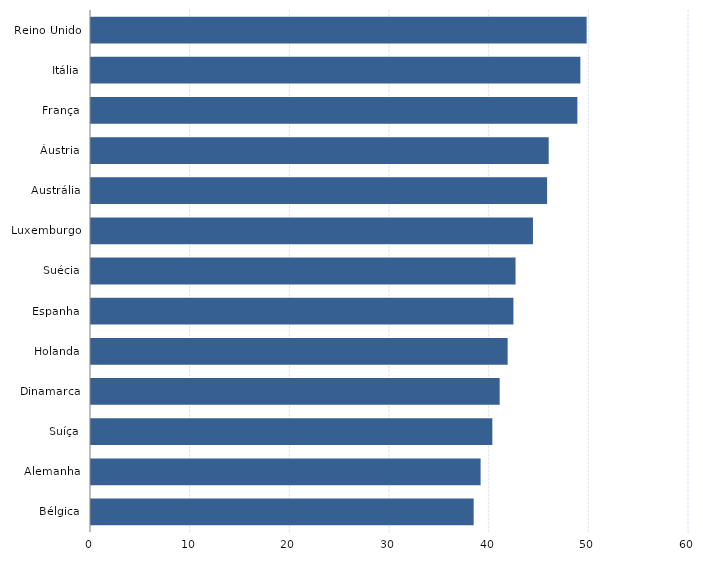
| Category | Series 0 |
|---|---|
| Bélgica | 38.396 |
| Alemanha | 39.09 |
| Suíça | 40.269 |
| Dinamarca | 41.004 |
| Holanda | 41.805 |
| Espanha | 42.384 |
| Suécia | 42.596 |
| Luxemburgo | 44.344 |
| Austrália | 45.763 |
| Áustria | 45.922 |
| França | 48.8 |
| Itália | 49.1 |
| Reino Unido | 49.729 |